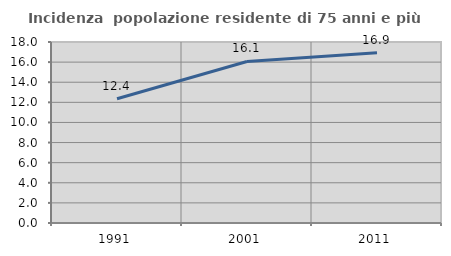
| Category | Incidenza  popolazione residente di 75 anni e più |
|---|---|
| 1991.0 | 12.36 |
| 2001.0 | 16.064 |
| 2011.0 | 16.931 |